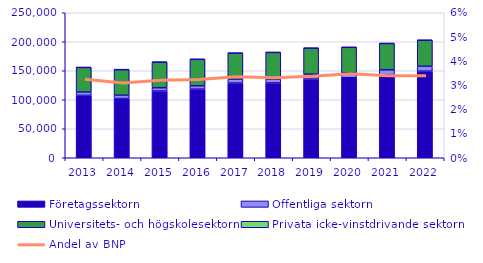
| Category | Företagssektorn | Offentliga sektorn | Universitets- och högskolesektorn | Privata icke-vinstdrivande sektorn |
|---|---|---|---|---|
| 2013.0 | 107505.965 | 5841.057 | 42352.351 | 350.288 |
| 2014.0 | 102093.175 | 5705.247 | 44116.065 | 366.415 |
| 2015.0 | 115077.253 | 5645.74 | 44103.957 | 305.826 |
| 2016.0 | 118311.196 | 5788.604 | 45602.01 | 329.693 |
| 2017.0 | 128810.311 | 6540.781 | 45030.718 | 214.814 |
| 2018.0 | 129013.321 | 6575.913 | 46039.332 | 205.249 |
| 2019.0 | 135628.722 | 8535.749 | 44775.359 | 220.056 |
| 2020.0 | 137916.645 | 8379.71 | 44109.214 | 222.259 |
| 2021.0 | 142919.383 | 8706.425 | 45424.965 | 225.112 |
| 2022.0 | 149253 | 8566 | 44802 | 225 |